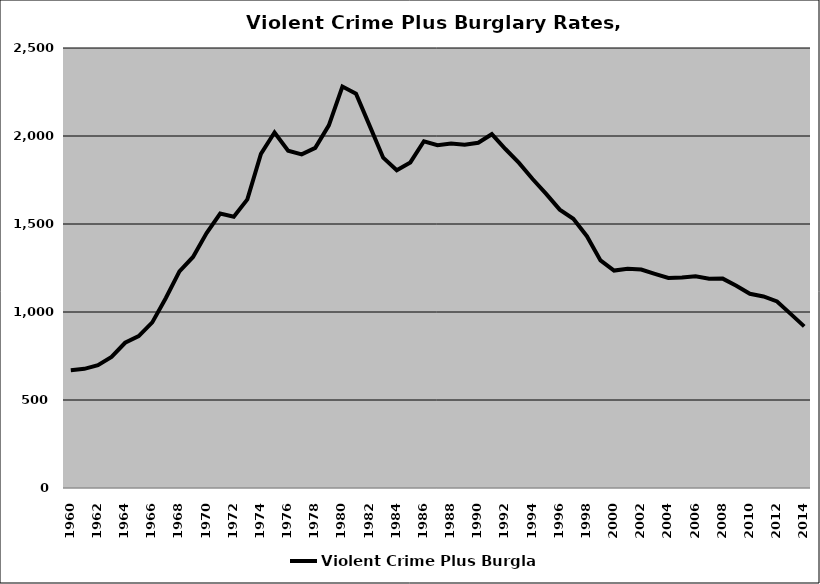
| Category | Violent Crime Plus Burglary |
|---|---|
| 1960.0 | 669.495 |
| 1961.0 | 677.073 |
| 1962.0 | 697.531 |
| 1963.0 | 744.561 |
| 1964.0 | 825.265 |
| 1965.0 | 862.876 |
| 1966.0 | 940.954 |
| 1967.0 | 1079.744 |
| 1968.0 | 1230.653 |
| 1969.0 | 1312.794 |
| 1970.0 | 1448.479 |
| 1971.0 | 1559.463 |
| 1972.0 | 1541.757 |
| 1973.0 | 1639.93 |
| 1974.0 | 1898.804 |
| 1975.0 | 2019.96 |
| 1976.0 | 1916.016 |
| 1977.0 | 1895.734 |
| 1978.0 | 1932.44 |
| 1979.0 | 2060.768 |
| 1980.0 | 2280.78 |
| 1981.0 | 2240.653 |
| 1982.0 | 2058.792 |
| 1983.0 | 1876.856 |
| 1984.0 | 1805.456 |
| 1985.0 | 1849.8 |
| 1986.0 | 1969.984 |
| 1987.0 | 1948.163 |
| 1988.0 | 1956.776 |
| 1989.0 | 1950.499 |
| 1990.0 | 1961.817 |
| 1991.0 | 2010.254 |
| 1992.0 | 1926.112 |
| 1993.0 | 1846.837 |
| 1994.0 | 1755.655 |
| 1995.0 | 1671.431 |
| 1996.0 | 1581.632 |
| 1997.0 | 1529.826 |
| 1998.0 | 1430.768 |
| 1999.0 | 1293.327 |
| 2000.0 | 1235.326 |
| 2001.0 | 1246.334 |
| 2002.0 | 1241.407 |
| 2003.0 | 1216.865 |
| 2004.0 | 1193.411 |
| 2005.0 | 1195.989 |
| 2006.0 | 1203.008 |
| 2007.0 | 1189.398 |
| 2008.0 | 1189.685 |
| 2009.0 | 1149.555 |
| 2010.0 | 1103.215 |
| 2011.0 | 1088.352 |
| 2012.0 | 1059.98 |
| 2013.0 | 989.429 |
| 2014.0 | 918.215 |